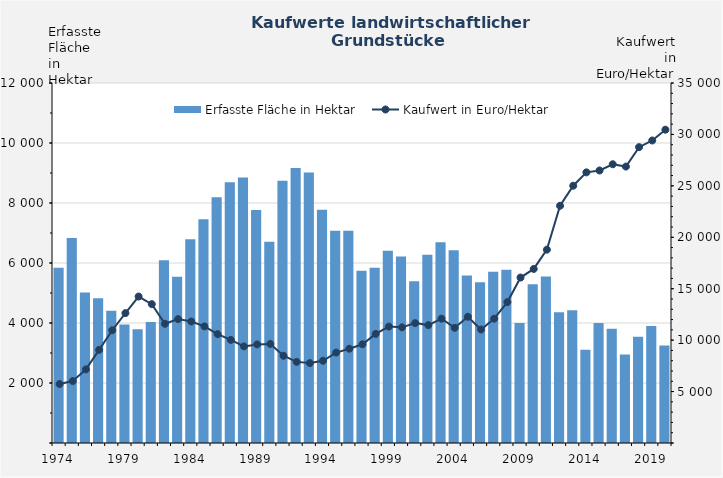
| Category | Erfasste Fläche in Hektar |
|---|---|
| 1974.0 | 5839 |
| 1975.0 | 6837 |
| 1976.0 | 5020 |
| 1977.0 | 4821 |
| 1978.0 | 4410 |
| 1979.0 | 3951 |
| 1980.0 | 3791 |
| 1981.0 | 4032 |
| 1982.0 | 6094 |
| 1983.0 | 5542 |
| 1984.0 | 6792 |
| 1985.0 | 7461 |
| 1986.0 | 8194 |
| 1987.0 | 8692 |
| 1988.0 | 8846 |
| 1989.0 | 7770 |
| 1990.0 | 6708 |
| 1991.0 | 8740 |
| 1992.0 | 9163 |
| 1993.0 | 9013 |
| 1994.0 | 7771 |
| 1995.0 | 7073 |
| 1996.0 | 7079 |
| 1997.0 | 5739 |
| 1998.0 | 5845 |
| 1999.0 | 6406 |
| 2000.0 | 6213 |
| 2001.0 | 5390 |
| 2002.0 | 6273 |
| 2003.0 | 6695 |
| 2004.0 | 6426 |
| 2005.0 | 5582 |
| 2006.0 | 5356 |
| 2007.0 | 5712 |
| 2008.0 | 5778 |
| 2009.0 | 3997 |
| 2010.0 | 5293 |
| 2011.0 | 5554 |
| 2012.0 | 4356 |
| 2013.0 | 4425 |
| 2014.0 | 3107 |
| 2015.0 | 3998 |
| 2016.0 | 3806 |
| 2017.0 | 2953 |
| 2018.0 | 3540 |
| 2019.0 | 3896 |
| 2020.0 | 3253 |